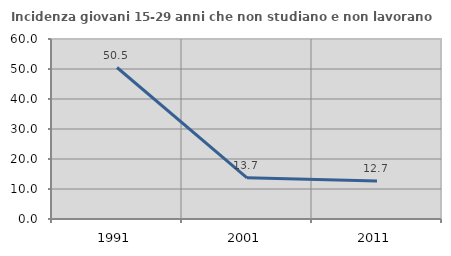
| Category | Incidenza giovani 15-29 anni che non studiano e non lavorano  |
|---|---|
| 1991.0 | 50.495 |
| 2001.0 | 13.725 |
| 2011.0 | 12.707 |